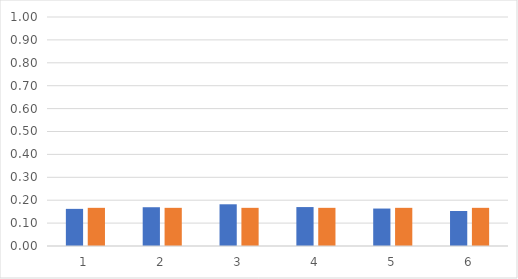
| Category | rel freq | prob |
|---|---|---|
| 0 | 0.162 | 0.167 |
| 1 | 0.169 | 0.167 |
| 2 | 0.182 | 0.167 |
| 3 | 0.17 | 0.167 |
| 4 | 0.164 | 0.167 |
| 5 | 0.153 | 0.167 |